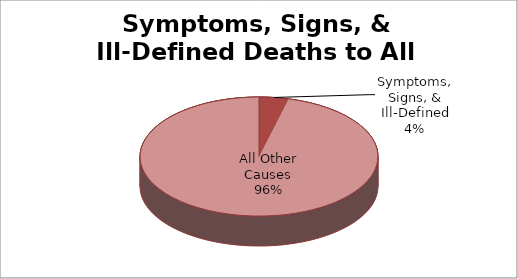
| Category | Series 0 |
|---|---|
| Symptoms, Signs, & Ill-Defined | 1 |
| All Other Causes | 24 |